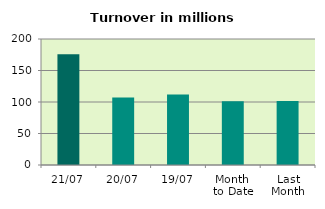
| Category | Series 0 |
|---|---|
| 21/07 | 175.881 |
| 20/07 | 107.189 |
| 19/07 | 111.724 |
| Month 
to Date | 101.21 |
| Last
Month | 101.544 |